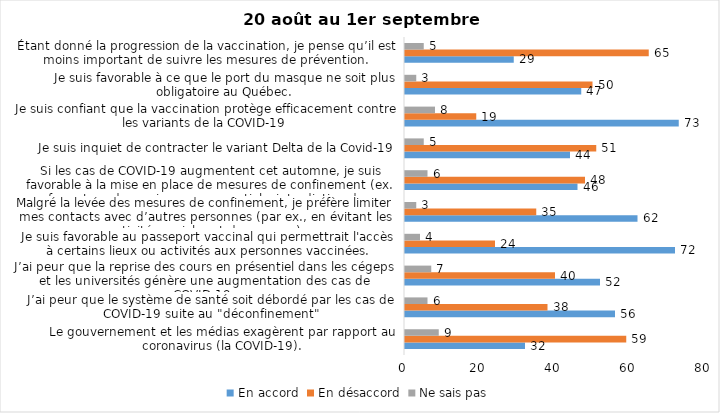
| Category | En accord | En désaccord | Ne sais pas |
|---|---|---|---|
| Le gouvernement et les médias exagèrent par rapport au coronavirus (la COVID-19). | 32 | 59 | 9 |
| J’ai peur que le système de santé soit débordé par les cas de COVID-19 suite au "déconfinement" | 56 | 38 | 6 |
| J’ai peur que la reprise des cours en présentiel dans les cégeps et les universités génère une augmentation des cas de COVID-19. | 52 | 40 | 7 |
| Je suis favorable au passeport vaccinal qui permettrait l'accès à certains lieux ou activités aux personnes vaccinées. | 72 | 24 | 4 |
| Malgré la levée des mesures de confinement, je préfère limiter mes contacts avec d’autres personnes (par ex., en évitant les activités sociales et de groupes) | 62 | 35 | 3 |
| Si les cas de COVID-19 augmentent cet automne, je suis favorable à la mise en place de mesures de confinement (ex. fermeture de services non essentiels, interdiction des rassemblements privés) | 46 | 48 | 6 |
| Je suis inquiet de contracter le variant Delta de la Covid-19 | 44 | 51 | 5 |
| Je suis confiant que la vaccination protège efficacement contre les variants de la COVID-19 | 73 | 19 | 8 |
| Je suis favorable à ce que le port du masque ne soit plus obligatoire au Québec. | 47 | 50 | 3 |
| Étant donné la progression de la vaccination, je pense qu’il est moins important de suivre les mesures de prévention. | 29 | 65 | 5 |